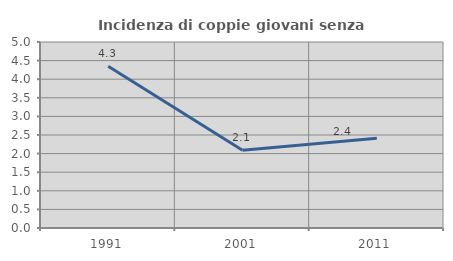
| Category | Incidenza di coppie giovani senza figli |
|---|---|
| 1991.0 | 4.348 |
| 2001.0 | 2.092 |
| 2011.0 | 2.41 |